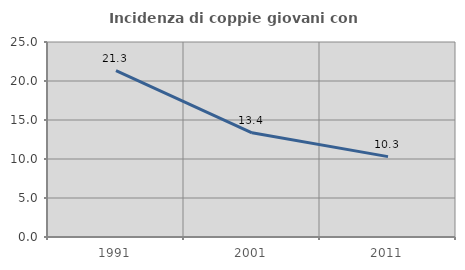
| Category | Incidenza di coppie giovani con figli |
|---|---|
| 1991.0 | 21.326 |
| 2001.0 | 13.362 |
| 2011.0 | 10.306 |